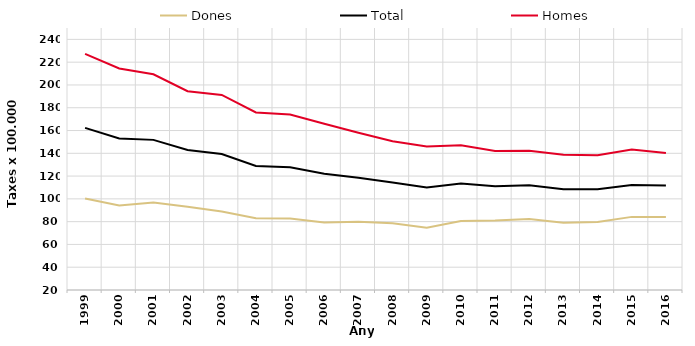
| Category | Dones | Total | Homes |
|---|---|---|---|
| 1999.0 | 100.369 | 162.334 | 227.287 |
| 2000.0 | 94.199 | 152.967 | 214.509 |
| 2001.0 | 96.716 | 151.791 | 209.347 |
| 2002.0 | 93.009 | 142.839 | 194.498 |
| 2003.0 | 88.969 | 139.297 | 191.243 |
| 2004.0 | 83.071 | 128.821 | 175.871 |
| 2005.0 | 82.706 | 127.851 | 174.074 |
| 2006.0 | 79.223 | 122.119 | 165.926 |
| 2007.0 | 79.94 | 118.591 | 157.971 |
| 2008.0 | 78.549 | 114.311 | 150.673 |
| 2009.0 | 74.61 | 109.95 | 145.93 |
| 2010.0 | 80.54 | 113.41 | 146.98 |
| 2011.0 | 81.03 | 111.12 | 141.96 |
| 2012.0 | 82.27 | 111.88 | 142.29 |
| 2013.0 | 79.12 | 108.48 | 138.81 |
| 2014.0 | 79.6 | 108.41 | 138.28 |
| 2015.0 | 84.19 | 112.26 | 143.37 |
| 2016.0 | 84.11 | 111.68 | 140.36 |